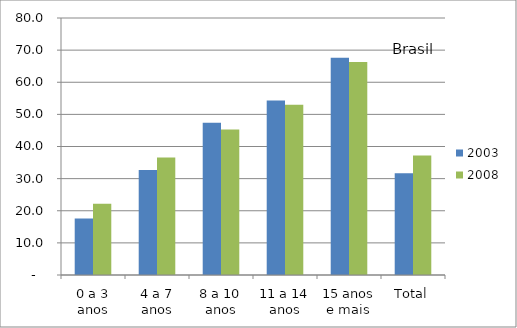
| Category | 2003 | 2008 |
|---|---|---|
| 0 a 3 anos | 17.6 | 22.2 |
| 4 a 7 anos | 32.7 | 36.6 |
| 8 a 10 anos | 47.4 | 45.3 |
| 11 a 14 anos | 54.3 | 53 |
| 15 anos e mais | 67.6 | 66.3 |
| Total | 31.7 | 37.2 |